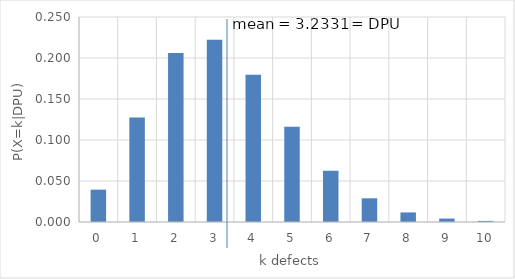
| Category | p(K) |
|---|---|
| 0.0 | 0.039 |
| 1.0 | 0.127 |
| 2.0 | 0.206 |
| 3.0 | 0.222 |
| 4.0 | 0.18 |
| 5.0 | 0.116 |
| 6.0 | 0.063 |
| 7.0 | 0.029 |
| 8.0 | 0.012 |
| 9.0 | 0.004 |
| 10.0 | 0.001 |